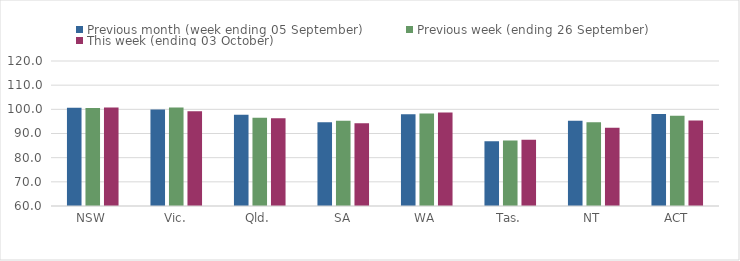
| Category | Previous month (week ending 05 September) | Previous week (ending 26 September) | This week (ending 03 October) |
|---|---|---|---|
| NSW | 100.63 | 100.54 | 100.78 |
| Vic. | 99.93 | 100.73 | 99.22 |
| Qld. | 97.78 | 96.47 | 96.27 |
| SA | 94.62 | 95.27 | 94.26 |
| WA | 97.97 | 98.32 | 98.69 |
| Tas. | 86.8 | 87.09 | 87.4 |
| NT | 95.3 | 94.69 | 92.42 |
| ACT | 98.04 | 97.39 | 95.42 |